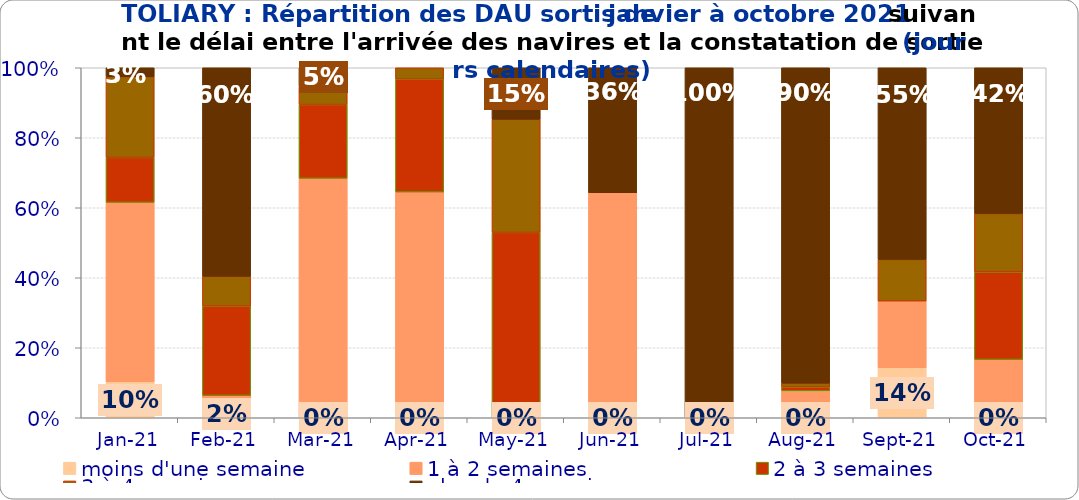
| Category | moins d'une semaine | 1 à 2 semaines | 2 à 3 semaines | 3 à 4 semaines | plus de 4 semaines |
|---|---|---|---|---|---|
| 2021-01-01 | 0.103 | 0.513 | 0.128 | 0.231 | 0.026 |
| 2021-02-01 | 0.021 | 0.043 | 0.255 | 0.085 | 0.596 |
| 2021-03-01 | 0 | 0.684 | 0.211 | 0.053 | 0.053 |
| 2021-04-01 | 0 | 0.645 | 0.323 | 0.032 | 0 |
| 2021-05-01 | 0 | 0 | 0.529 | 0.324 | 0.147 |
| 2021-06-01 | 0 | 0.643 | 0 | 0 | 0.357 |
| 2021-07-01 | 0 | 0 | 0 | 0 | 1 |
| 2021-08-01 | 0 | 0.077 | 0.011 | 0.011 | 0.901 |
| 2021-09-01 | 0.143 | 0.19 | 0 | 0.119 | 0.548 |
| 2021-10-01 | 0 | 0.167 | 0.25 | 0.167 | 0.417 |